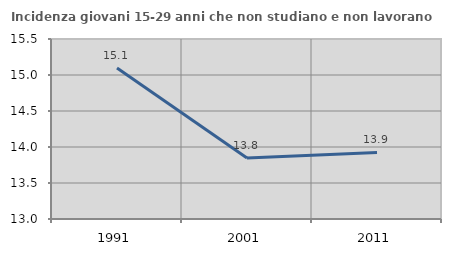
| Category | Incidenza giovani 15-29 anni che non studiano e non lavorano  |
|---|---|
| 1991.0 | 15.098 |
| 2001.0 | 13.846 |
| 2011.0 | 13.924 |